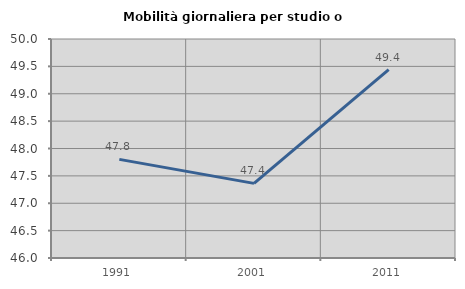
| Category | Mobilità giornaliera per studio o lavoro |
|---|---|
| 1991.0 | 47.801 |
| 2001.0 | 47.363 |
| 2011.0 | 49.439 |